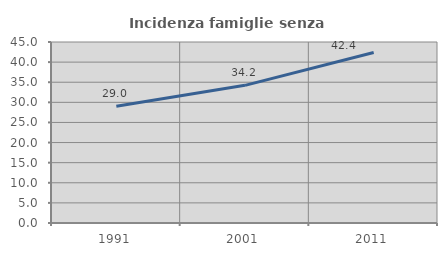
| Category | Incidenza famiglie senza nuclei |
|---|---|
| 1991.0 | 29.027 |
| 2001.0 | 34.222 |
| 2011.0 | 42.391 |